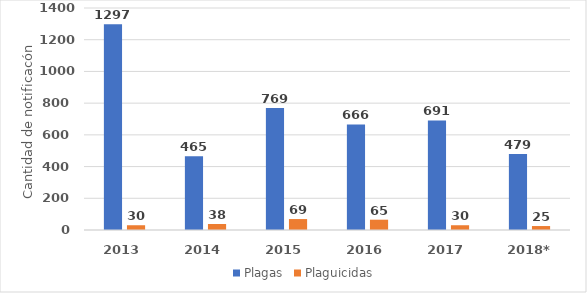
| Category | Plagas | Plaguicidas |
|---|---|---|
| 2013 | 1297 | 30 |
| 2014 | 465 | 38 |
| 2015 | 769 | 69 |
| 2016 | 666 | 65 |
| 2017 | 691 | 30 |
| 2018* | 479 | 25 |